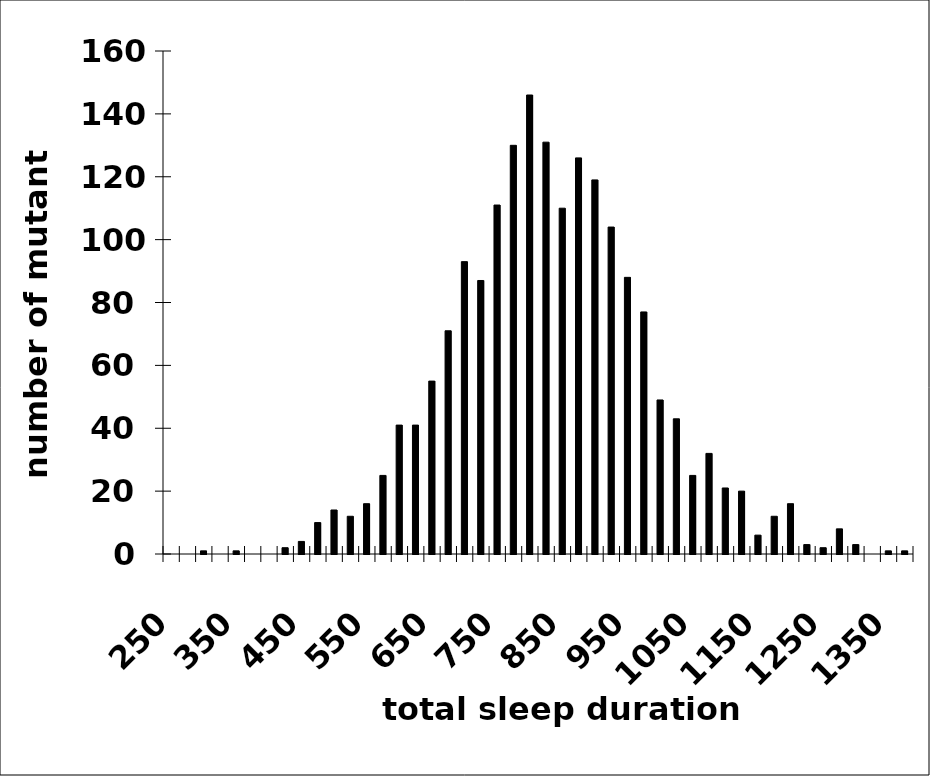
| Category | Frequency |
|---|---|
| 250 | 0 |
| 275 | 0 |
| 300 | 1 |
| 325 | 0 |
| 350 | 1 |
| 375 | 0 |
| 400 | 0 |
| 425 | 2 |
| 450 | 4 |
| 475 | 10 |
| 500 | 14 |
| 525 | 12 |
| 550 | 16 |
| 575 | 25 |
| 600 | 41 |
| 625 | 41 |
| 650 | 55 |
| 675 | 71 |
| 700 | 93 |
| 725 | 87 |
| 750 | 111 |
| 775 | 130 |
| 800 | 146 |
| 825 | 131 |
| 850 | 110 |
| 875 | 126 |
| 900 | 119 |
| 925 | 104 |
| 950 | 88 |
| 975 | 77 |
| 1000 | 49 |
| 1025 | 43 |
| 1050 | 25 |
| 1075 | 32 |
| 1100 | 21 |
| 1125 | 20 |
| 1150 | 6 |
| 1175 | 12 |
| 1200 | 16 |
| 1225 | 3 |
| 1250 | 2 |
| 1275 | 8 |
| 1300 | 3 |
| 1325 | 0 |
| 1350 | 1 |
| More | 1 |